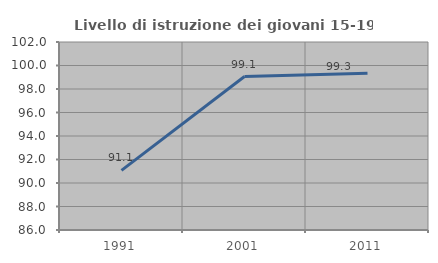
| Category | Livello di istruzione dei giovani 15-19 anni |
|---|---|
| 1991.0 | 91.074 |
| 2001.0 | 99.061 |
| 2011.0 | 99.335 |